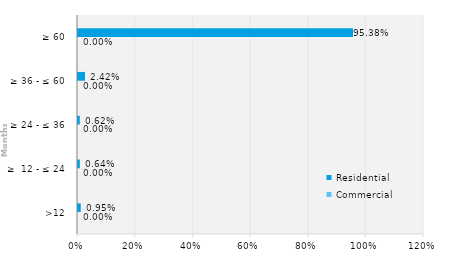
| Category | Commercial | Residential |
|---|---|---|
| >12 | 0 | 0.009 |
| ≥  12 - ≤ 24 | 0 | 0.006 |
| ≥ 24 - ≤ 36 | 0 | 0.006 |
| ≥ 36 - ≤ 60 | 0 | 0.024 |
| ≥ 60 | 0 | 0.954 |